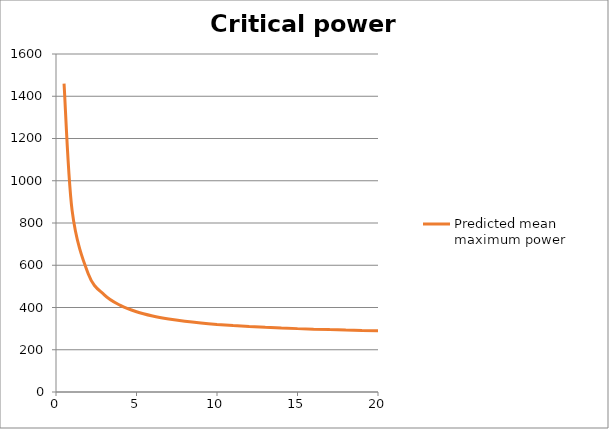
| Category | Predicted mean maximum power |
|---|---|
| 0.5 | 1460 |
| 1.0 | 860 |
| 2.0 | 560 |
| 3.0 | 460 |
| 4.0 | 410 |
| 5.0 | 380 |
| 6.0 | 360 |
| 7.0 | 345.714 |
| 8.0 | 335 |
| 9.0 | 326.667 |
| 10.0 | 320 |
| 11.0 | 314.545 |
| 12.0 | 310 |
| 13.0 | 306.154 |
| 14.0 | 302.857 |
| 15.0 | 300 |
| 16.0 | 297.5 |
| 17.0 | 295.294 |
| 18.0 | 293.333 |
| 19.0 | 291.579 |
| 20.0 | 290 |
| 21.0 | 288.571 |
| 22.0 | 287.273 |
| 23.0 | 286.087 |
| 24.0 | 285 |
| 25.0 | 284 |
| 26.0 | 283.077 |
| 27.0 | 282.222 |
| 28.0 | 281.429 |
| 29.0 | 280.69 |
| 30.0 | 280 |
| 31.0 | 279.355 |
| 32.0 | 278.75 |
| 33.0 | 278.182 |
| 34.0 | 277.647 |
| 35.0 | 277.143 |
| 36.0 | 276.667 |
| 37.0 | 276.216 |
| 38.0 | 275.789 |
| 39.0 | 275.385 |
| 40.0 | 275 |
| 41.0 | 274.634 |
| 42.0 | 274.286 |
| 43.0 | 273.953 |
| 44.0 | 273.636 |
| 45.0 | 273.333 |
| 46.0 | 273.043 |
| 47.0 | 272.766 |
| 48.0 | 272.5 |
| 49.0 | 272.245 |
| 50.0 | 272 |
| 51.0 | 271.765 |
| 52.0 | 271.538 |
| 53.0 | 271.321 |
| 54.0 | 271.111 |
| 55.0 | 270.909 |
| 56.0 | 270.714 |
| 57.0 | 270.526 |
| 58.0 | 270.345 |
| 59.0 | 270.169 |
| 60.0 | 270 |